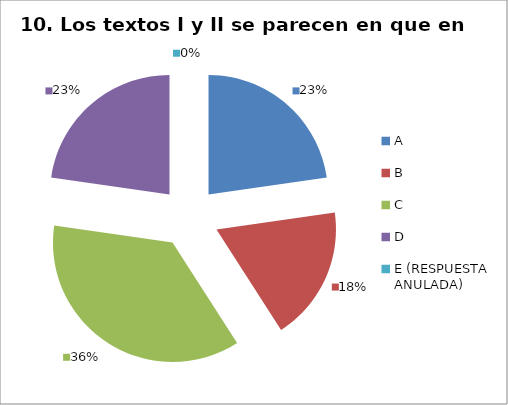
| Category | CANTIDAD DE RESPUESTAS PREGUNTA (10) | PORCENTAJE |
|---|---|---|
| A | 5 | 0.227 |
| B | 4 | 0.182 |
| C | 8 | 0.364 |
| D | 5 | 0.227 |
| E (RESPUESTA ANULADA) | 0 | 0 |